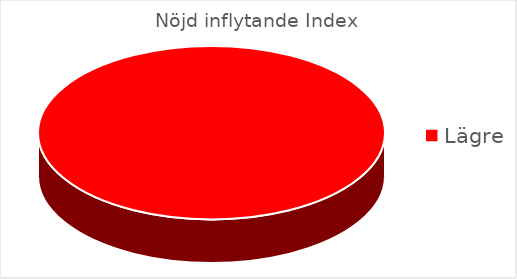
| Category | Total |
|---|---|
| Lägre | 4 |